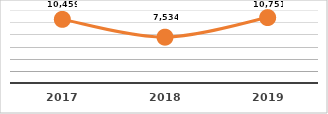
| Category | CERTIFICACIÓN DE COMPETENCIAS (%) |
|---|---|
| 2017.0 | 10459 |
| 2018.0 | 7534 |
| 2019.0 | 10751 |